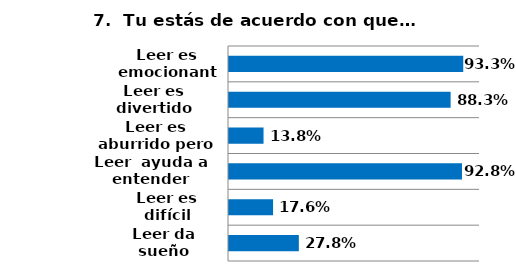
| Category | Series 0 |
|---|---|
| Leer es emocionante | 0.933 |
| Leer es divertido | 0.883 |
| Leer es aburrido pero es una obligación | 0.138 |
| Leer  ayuda a entender muchas cosas del mundo | 0.928 |
| Leer es difícil | 0.176 |
| Leer da sueño | 0.278 |